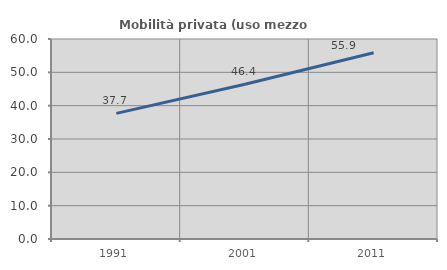
| Category | Mobilità privata (uso mezzo privato) |
|---|---|
| 1991.0 | 37.695 |
| 2001.0 | 46.434 |
| 2011.0 | 55.851 |